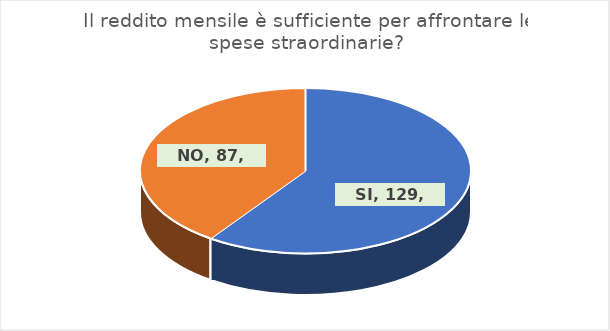
| Category | Series 0 |
|---|---|
| SI | 129 |
| NO | 87 |